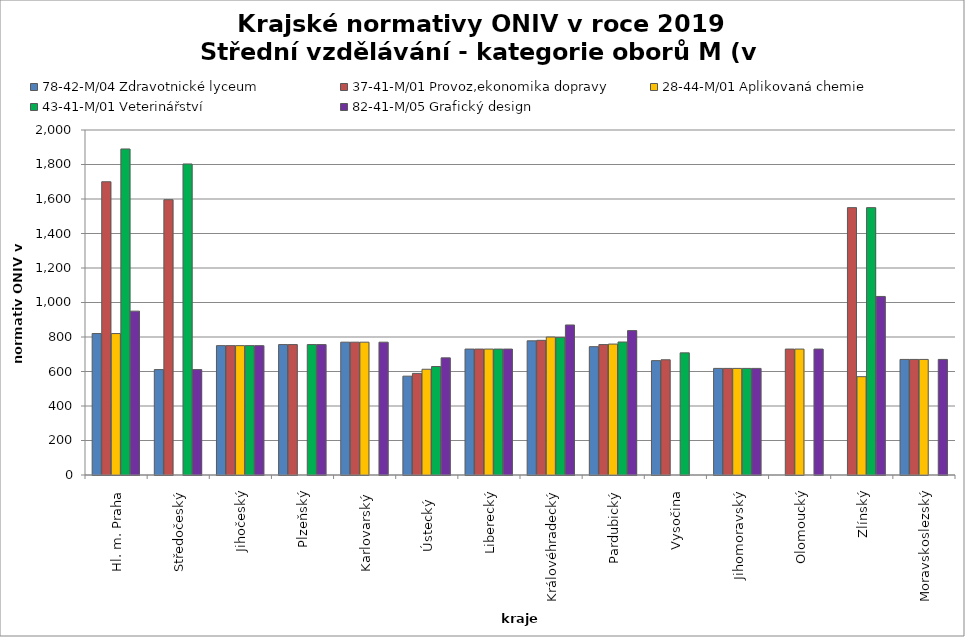
| Category | 78-42-M/04 Zdravotnické lyceum | 37-41-M/01 Provoz,ekonomika dopravy | 28-44-M/01 Aplikovaná chemie | 43-41-M/01 Veterinářství | 82-41-M/05 Grafický design |
|---|---|---|---|---|---|
| Hl. m. Praha | 820 | 1700 | 820 | 1890 | 950 |
| Středočeský | 611 | 1596 | 0 | 1803 | 611 |
| Jihočeský | 750 | 750 | 750 | 750 | 750 |
| Plzeňský | 756 | 756 | 0 | 756 | 756 |
| Karlovarský  | 770 | 770 | 770 | 0 | 770 |
| Ústecký   | 573 | 589 | 613 | 629 | 679 |
| Liberecký | 730 | 730 | 730 | 730 | 730 |
| Královéhradecký | 777.8 | 780.7 | 799.7 | 797.7 | 869.7 |
| Pardubický | 744 | 756 | 759 | 771 | 837 |
| Vysočina | 663 | 668 | 0 | 708 | 0 |
| Jihomoravský | 618 | 618 | 618 | 618 | 618 |
| Olomoucký | 0 | 730 | 730 | 0 | 730 |
| Zlínský | 0 | 1550 | 570 | 1550 | 1035 |
| Moravskoslezský | 670 | 670 | 670 | 0 | 670 |